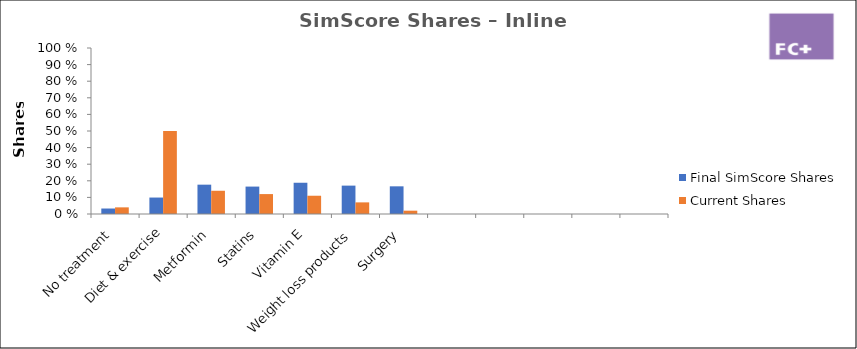
| Category | Final SimScore Shares | Current Shares |
|---|---|---|
| No treatment | 0.033 | 0.04 |
| Diet & exercise | 0.099 | 0.5 |
| Metformin | 0.177 | 0.14 |
| Statins | 0.165 | 0.12 |
| Vitamin E | 0.188 | 0.11 |
| Weight loss products | 0.171 | 0.07 |
| Surgery | 0.167 | 0.02 |